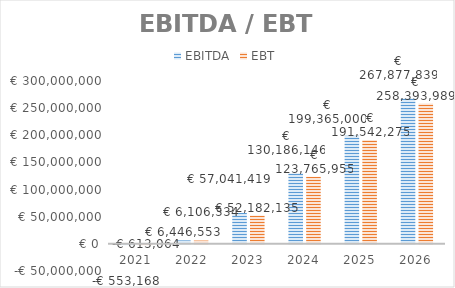
| Category | EBITDA | EBT |
|---|---|---|
| 2021.0 | -553168.203 | -613063.639 |
| 2022.0 | 6446553.113 | 6106333.747 |
| 2023.0 | 57041418.984 | 52182134.564 |
| 2024.0 | 130186146.444 | 123765954.963 |
| 2025.0 | 199364999.779 | 191542275.238 |
| 2026.0 | 267877839.062 | 258393989.01 |